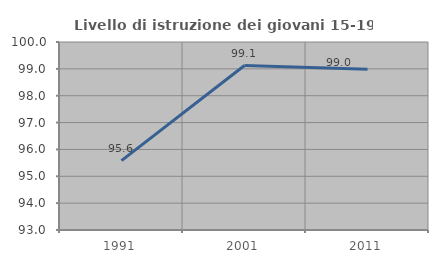
| Category | Livello di istruzione dei giovani 15-19 anni |
|---|---|
| 1991.0 | 95.582 |
| 2001.0 | 99.123 |
| 2011.0 | 98.983 |